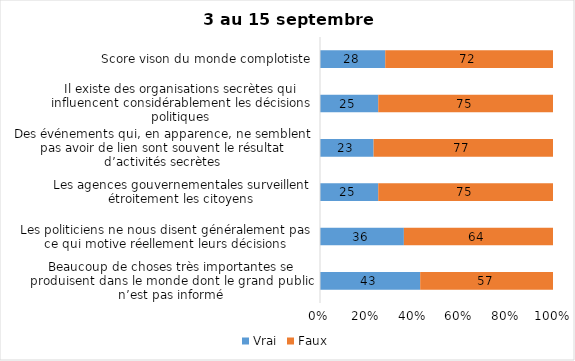
| Category | Vrai | Faux |
|---|---|---|
| Beaucoup de choses très importantes se produisent dans le monde dont le grand public n’est pas informé | 43 | 57 |
| Les politiciens ne nous disent généralement pas ce qui motive réellement leurs décisions | 36 | 64 |
| Les agences gouvernementales surveillent étroitement les citoyens | 25 | 75 |
| Des événements qui, en apparence, ne semblent pas avoir de lien sont souvent le résultat d’activités secrètes | 23 | 77 |
| Il existe des organisations secrètes qui influencent considérablement les décisions politiques | 25 | 75 |
| Score vison du monde complotiste | 28 | 72 |